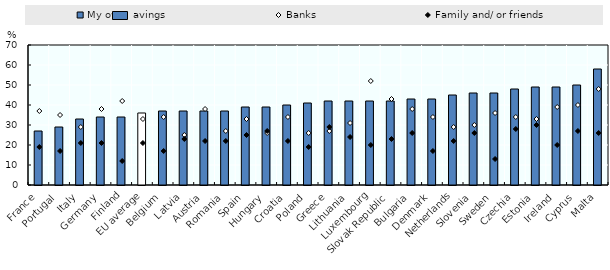
| Category | My own savings |
|---|---|
| France | 27 |
| Portugal | 29 |
| Italy | 33 |
| Germany | 34 |
| Finland | 34 |
| EU average | 36 |
| Belgium | 37 |
| Latvia | 37 |
| Austria | 37 |
| Romania | 37 |
| Spain | 39 |
| Hungary | 39 |
| Croatia | 40 |
| Poland | 41 |
| Greece | 42 |
| Lithuania | 42 |
| Luxembourg | 42 |
| Slovak Republic | 42 |
| Bulgaria | 43 |
| Denmark | 43 |
| Netherlands | 45 |
| Slovenia | 46 |
| Sweden | 46 |
| Czechia | 48 |
| Estonia | 49 |
| Ireland | 49 |
| Cyprus | 50 |
| Malta | 58 |